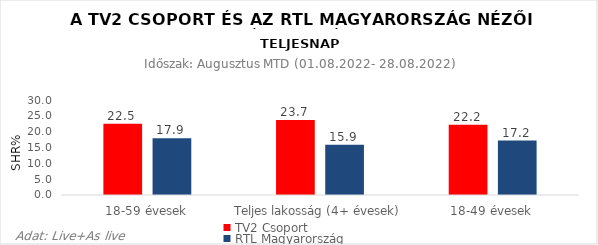
| Category | TV2 Csoport | RTL Magyarország |
|---|---|---|
| 18-59 évesek | 22.5 | 17.9 |
| Teljes lakosság (4+ évesek) | 23.7 | 15.9 |
| 18-49 évesek | 22.2 | 17.2 |